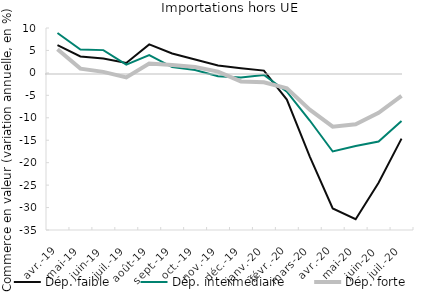
| Category | Dép. faible | Dép. intermédiaire | Dép. forte |
|---|---|---|---|
| 2019-04-01 | 6.171 | 8.9 | 5.284 |
| 2019-05-01 | 3.671 | 5.214 | 0.952 |
| 2019-06-01 | 3.229 | 5.071 | 0.222 |
| 2019-07-01 | 2.203 | 1.847 | -0.993 |
| 2019-08-01 | 6.345 | 3.966 | 2.103 |
| 2019-09-01 | 4.322 | 1.295 | 1.731 |
| 2019-10-01 | 2.975 | 0.652 | 1.305 |
| 2019-11-01 | 1.657 | -0.753 | 0.295 |
| 2019-12-01 | 1.057 | -1.009 | -1.895 |
| 2020-01-01 | 0.514 | -0.456 | -2.077 |
| 2020-02-01 | -5.944 | -4.175 | -3.456 |
| 2020-03-01 | -18.646 | -10.611 | -8.204 |
| 2020-04-01 | -30.212 | -17.507 | -11.986 |
| 2020-05-01 | -32.604 | -16.273 | -11.463 |
| 2020-06-01 | -24.462 | -15.289 | -8.894 |
| 2020-07-01 | -14.648 | -10.733 | -5.136 |